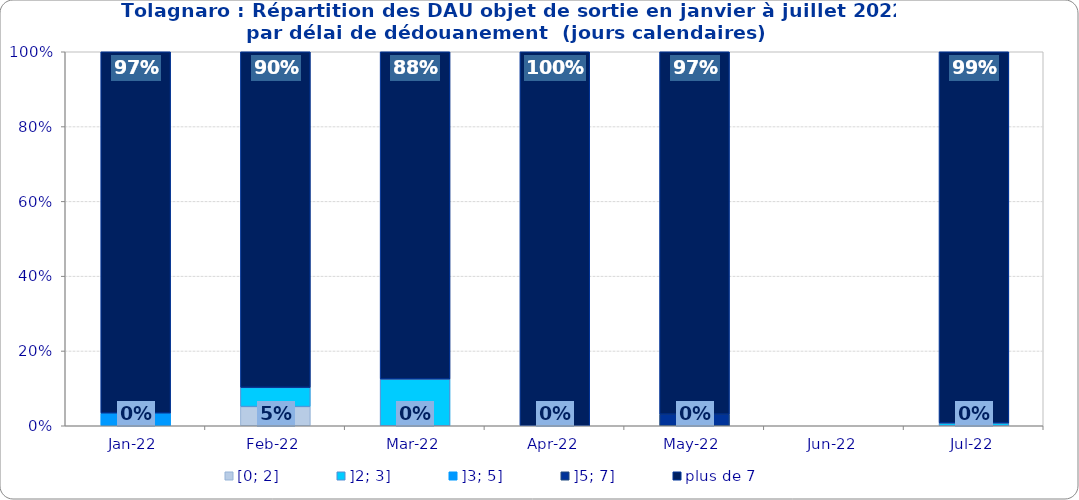
| Category | [0; 2] | ]2; 3] | ]3; 5] | ]5; 7] | plus de 7 |
|---|---|---|---|---|---|
| 2022-01-01 | 0 | 0 | 0.034 | 0 | 0.966 |
| 2022-02-01 | 0.051 | 0.051 | 0 | 0 | 0.897 |
| 2022-03-01 | 0 | 0.125 | 0 | 0 | 0.875 |
| 2022-04-01 | 0 | 0 | 0 | 0 | 1 |
| 2022-05-01 | 0 | 0 | 0 | 0.031 | 0.969 |
| 2022-06-01 | 0 | 0 | 0 | 0 | 0 |
| 2022-07-01 | 0 | 0.007 | 0 | 0 | 0.993 |